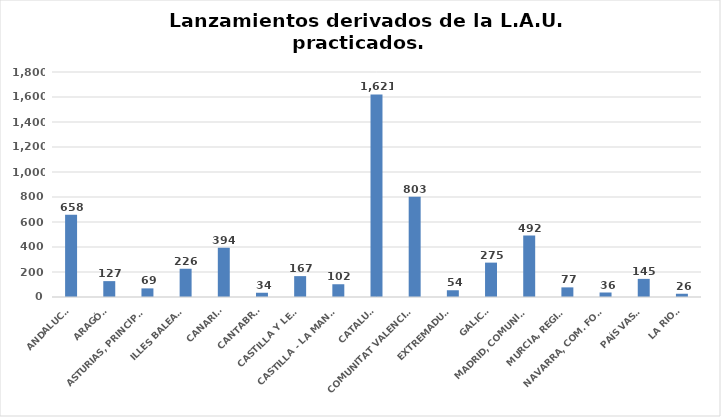
| Category | Series 0 |
|---|---|
| ANDALUCÍA | 658 |
| ARAGÓN | 127 |
| ASTURIAS, PRINCIPADO | 69 |
| ILLES BALEARS | 226 |
| CANARIAS | 394 |
| CANTABRIA | 34 |
| CASTILLA Y LEÓN | 167 |
| CASTILLA - LA MANCHA | 102 |
| CATALUÑA | 1621 |
| COMUNITAT VALENCIANA | 803 |
| EXTREMADURA | 54 |
| GALICIA | 275 |
| MADRID, COMUNIDAD | 492 |
| MURCIA, REGIÓN | 77 |
| NAVARRA, COM. FORAL | 36 |
| PAÍS VASCO | 145 |
| LA RIOJA | 26 |